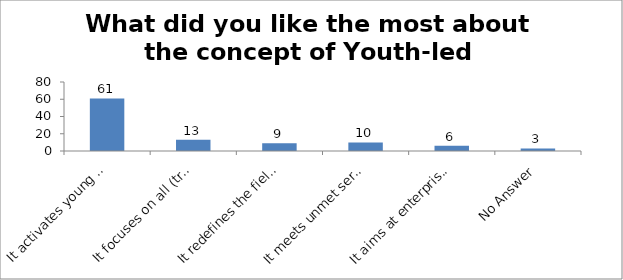
| Category | What did you like the most about the concept of Youth-led Changemaking? |
|---|---|
| It activates young people as Changemakers | 61 |
| It focuses on all (troubled and prepared) young people | 13 |
| It redefines the field of youth development | 9 |
| It meets unmet service needs of the society | 10 |
| It aims at enterprising education | 6 |
| No Answer | 3 |